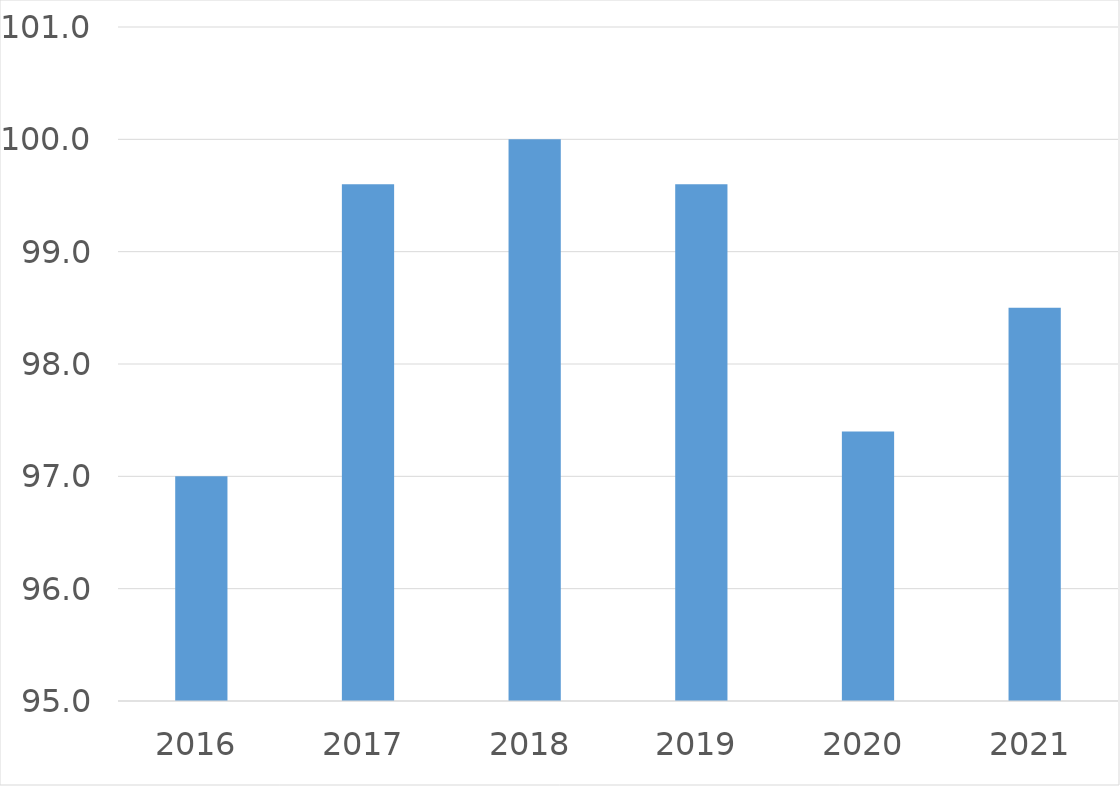
| Category | Series 0 |
|---|---|
| 2016 | 97 |
| 2017 | 99.6 |
| 2018 | 100 |
| 2019 | 99.6 |
| 2020 | 97.4 |
| 2021 | 98.5 |